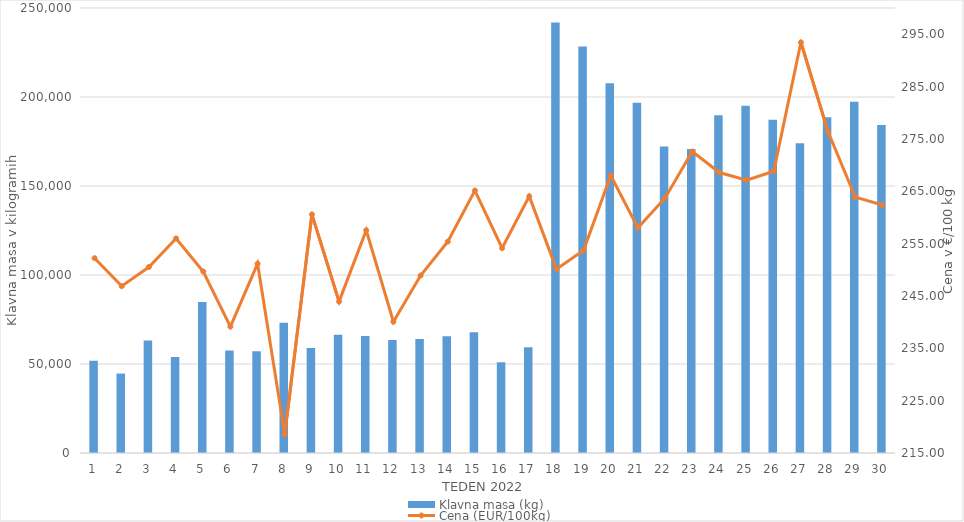
| Category | Klavna masa (kg) |
|---|---|
| 1.0 | 51818 |
| 2.0 | 44619 |
| 3.0 | 63233 |
| 4.0 | 53993 |
| 5.0 | 84871 |
| 6.0 | 57648 |
| 7.0 | 57159 |
| 8.0 | 73139 |
| 9.0 | 59056 |
| 10.0 | 66417 |
| 11.0 | 65723 |
| 12.0 | 63530 |
| 13.0 | 64069 |
| 14.0 | 65564 |
| 15.0 | 67787 |
| 16.0 | 50958 |
| 17.0 | 59387 |
| 18.0 | 241833 |
| 19.0 | 228389 |
| 20.0 | 207661 |
| 21.0 | 196732 |
| 22.0 | 172190 |
| 23.0 | 170751 |
| 24.0 | 189775 |
| 25.0 | 195029 |
| 26.0 | 187239 |
| 27.0 | 173967 |
| 28.0 | 188601 |
| 29.0 | 197293 |
| 30.0 | 184259 |